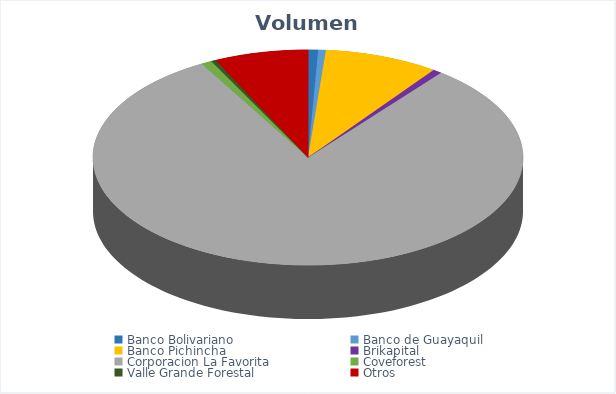
| Category | VOLUMEN ($USD) |
|---|---|
| Banco Bolivariano | 3278.07 |
| Banco de Guayaquil | 2478 |
| Banco Pichincha | 37312 |
| Brikapital | 3000 |
| Corporacion La Favorita | 353303.91 |
| Coveforest | 3502.2 |
| Valle Grande Forestal | 1500.2 |
| Otros | 30729.9 |